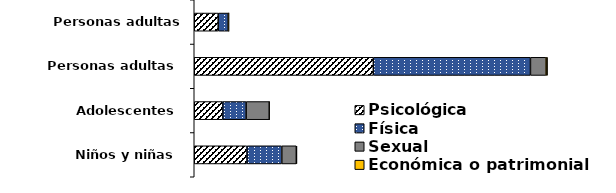
| Category | Psicológica | Física | Sexual | Económica o patrimonial |
|---|---|---|---|---|
| Niños y niñas | 10046 | 6628 | 2771 | 111 |
| Adolescentes | 5436 | 4450 | 4407 | 56 |
| Personas adultas | 34111 | 29925 | 2985 | 283 |
| Personas adultas mayores | 4562 | 1903 | 86 | 80 |